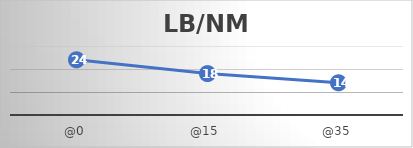
| Category | LB/NM |
|---|---|
| @0 | 24 |
| @15 | 18 |
| @35 | 14 |